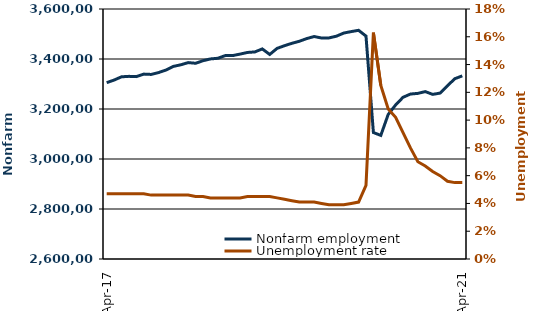
| Category |  Nonfarm employment  |
|---|---|
| 2017-04-01 | 3305400 |
| 2017-05-01 | 3315800 |
| 2017-06-01 | 3328800 |
| 2017-07-01 | 3330600 |
| 2017-08-01 | 3329500 |
| 2017-09-01 | 3339600 |
| 2017-10-01 | 3338300 |
| 2017-11-01 | 3345700 |
| 2017-12-01 | 3355800 |
| 2018-01-01 | 3370400 |
| 2018-02-01 | 3376800 |
| 2018-03-01 | 3385600 |
| 2018-04-01 | 3382900 |
| 2018-05-01 | 3393100 |
| 2018-06-01 | 3400300 |
| 2018-07-01 | 3402900 |
| 2018-08-01 | 3413600 |
| 2018-09-01 | 3413600 |
| 2018-10-01 | 3419600 |
| 2018-11-01 | 3426200 |
| 2018-12-01 | 3428300 |
| 2019-01-01 | 3440300 |
| 2019-02-01 | 3418100 |
| 2019-03-01 | 3442500 |
| 2019-04-01 | 3453200 |
| 2019-05-01 | 3462800 |
| 2019-06-01 | 3470900 |
| 2019-07-01 | 3481700 |
| 2019-08-01 | 3489900 |
| 2019-09-01 | 3483900 |
| 2019-10-01 | 3484300 |
| 2019-11-01 | 3491200 |
| 2019-12-01 | 3503800 |
| 2020-01-01 | 3509600 |
| 2020-02-01 | 3514800 |
| 2020-03-01 | 3491700 |
| 2020-04-01 | 3105900 |
| 2020-05-01 | 3094400 |
| 2020-06-01 | 3178300 |
| 2020-07-01 | 3216200 |
| 2020-08-01 | 3246800 |
| 2020-09-01 | 3259800 |
| 2020-10-01 | 3262500 |
| 2020-11-01 | 3269600 |
| 2020-12-01 | 3258500 |
| 2021-01-01 | 3263600 |
| 2021-02-01 | 3293200 |
| 2021-03-01 | 3321300 |
| 2021-04-01 | 3332500 |